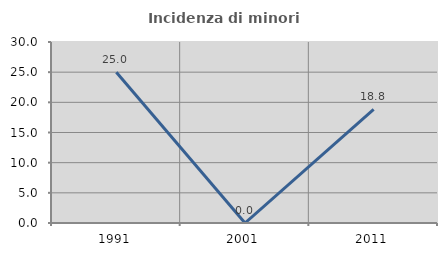
| Category | Incidenza di minori stranieri |
|---|---|
| 1991.0 | 25 |
| 2001.0 | 0 |
| 2011.0 | 18.841 |